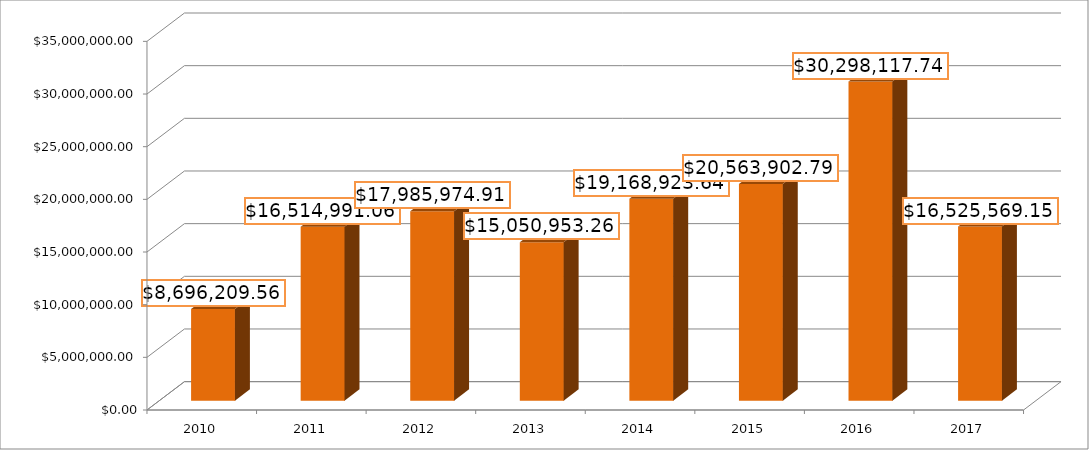
| Category | Series 1 |
|---|---|
| 2010.0 | 8696209.56 |
| 2011.0 | 16514991.06 |
| 2012.0 | 17985974.91 |
| 2013.0 | 15050953.26 |
| 2014.0 | 19168923.64 |
| 2015.0 | 20563902.79 |
| 2016.0 | 30298117.74 |
| 2017.0 | 16525569.15 |